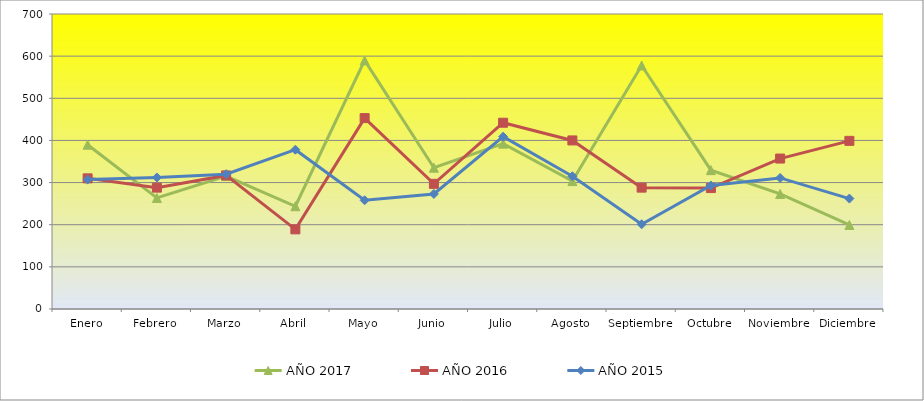
| Category | AÑO 2017 | AÑO 2016 | AÑO 2015 |
|---|---|---|---|
| Enero | 389.841 | 310 | 307 |
| Febrero | 263.492 | 288 | 312 |
| Marzo | 315.556 | 317 | 320 |
| Abril | 243.81 | 189 | 378 |
| Mayo | 589.841 | 453 | 258 |
| Junio | 335.238 | 297 | 273 |
| Julio | 392.381 | 442 | 409 |
| Agosto | 303.492 | 400 | 315 |
| Septiembre | 577.778 | 288 | 201 |
| Octubre | 329.524 | 287 | 293 |
| Noviembre | 273.016 | 357 | 311 |
| Diciembre | 199.365 | 399 | 262 |